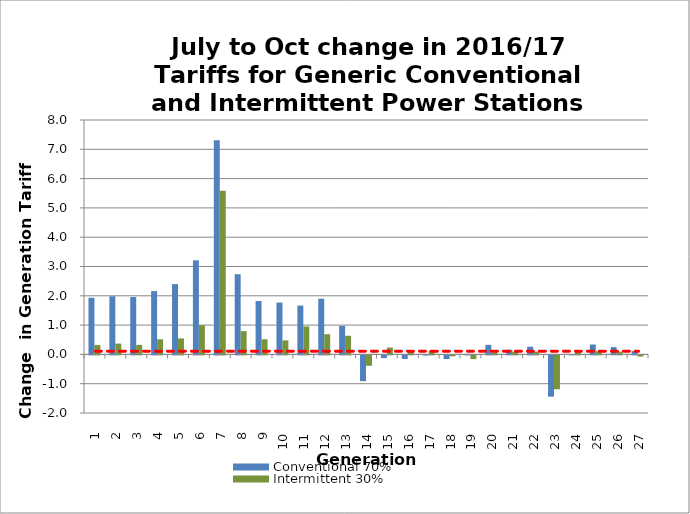
| Category | Conventional 70% | Intermittent 30% |
|---|---|---|
| 1.0 | 1.934 | 0.323 |
| 2.0 | 1.984 | 0.369 |
| 3.0 | 1.958 | 0.324 |
| 4.0 | 2.16 | 0.514 |
| 5.0 | 2.398 | 0.545 |
| 6.0 | 3.209 | 0.993 |
| 7.0 | 7.307 | 5.583 |
| 8.0 | 2.736 | 0.794 |
| 9.0 | 1.822 | 0.515 |
| 10.0 | 1.769 | 0.478 |
| 11.0 | 1.667 | 0.954 |
| 12.0 | 1.902 | 0.688 |
| 13.0 | 0.974 | 0.636 |
| 14.0 | -0.878 | -0.354 |
| 15.0 | -0.093 | 0.234 |
| 16.0 | -0.12 | 0.081 |
| 17.0 | -0.005 | 0.131 |
| 18.0 | -0.125 | -0.03 |
| 19.0 | 0.018 | -0.127 |
| 20.0 | 0.326 | 0.068 |
| 21.0 | 0.16 | 0.098 |
| 22.0 | 0.262 | 0.095 |
| 23.0 | -1.409 | -1.155 |
| 24.0 | 0.008 | 0.084 |
| 25.0 | 0.338 | 0.11 |
| 26.0 | 0.248 | 0.094 |
| 27.0 | 0.116 | -0.039 |